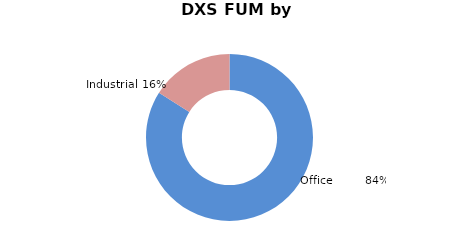
| Category | Series 0 |
|---|---|
| Office        | 0.84 |
| Industrial | 0.16 |
| Retail | 0 |
| International | 0 |